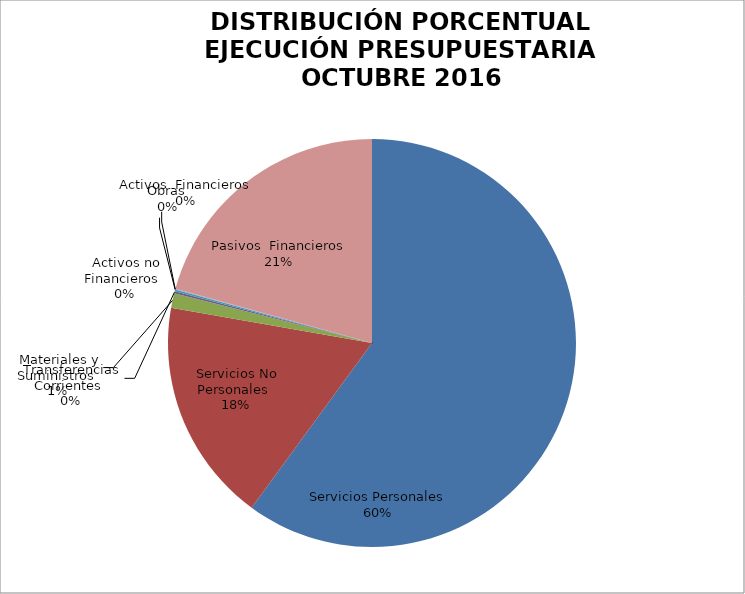
| Category | Series 0 | Series 1 |
|---|---|---|
| Servicios Personales | 10960704.24 | 0.6 |
| Servicios No Personales | 3235249.31 | 0.177 |
| Materiales y Suministros | 210383.95 | 0.012 |
| Transferencias Corrientes | 30000 | 0.001 |
| Activos no Financieros | 24619.85 | 0.001 |
| Obras | 0 | 0 |
| Activos  Financieros | 13200 | 0.001 |
| Pasivos  Financieros | 3780679.07 | 0.207 |